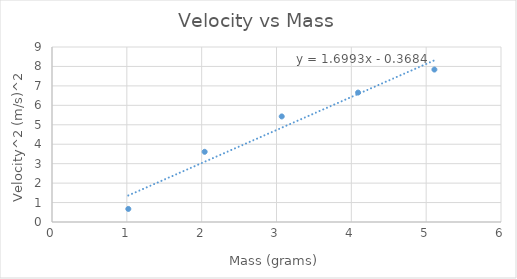
| Category | Velocity^2 (m/s)^2 |
|---|---|
| 1.02 | 0.672 |
| 2.04 | 3.61 |
| 3.07 | 5.429 |
| 4.09 | 6.656 |
| 5.11 | 7.84 |